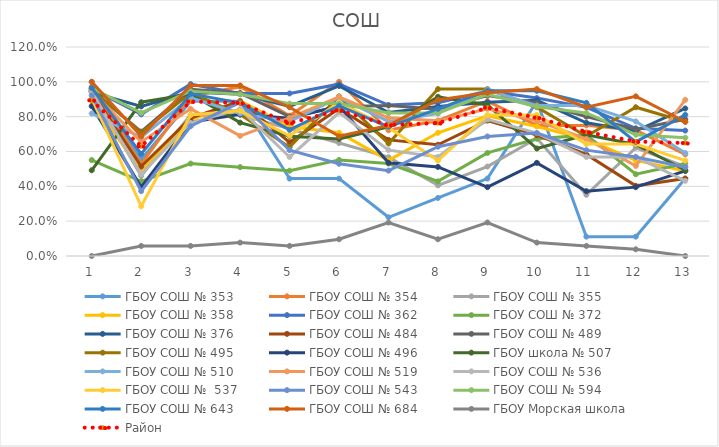
| Category | ГБОУ СОШ № 353 | ГБОУ СОШ № 354 | ГБОУ СОШ № 355 | ГБОУ СОШ № 358 | ГБОУ СОШ № 362 | ГБОУ СОШ № 372 | ГБОУ СОШ № 376 | ГБОУ СОШ № 484 | ГБОУ СОШ № 489 | ГБОУ СОШ № 495 | ГБОУ СОШ № 496 | ГБОУ школа № 507 | ГБОУ СОШ № 510 | ГБОУ СОШ № 519 | ГБОУ СОШ № 536 | ГБОУ СОШ №  537 | ГБОУ СОШ № 543 | ГБОУ СОШ № 594 | ГБОУ СОШ № 643 | ГБОУ СОШ № 684 | ГБОУ Морская школа | Район |
|---|---|---|---|---|---|---|---|---|---|---|---|---|---|---|---|---|---|---|---|---|---|---|
| 0 | 1 | 0.972 | 0.946 | 0.89 | 0.96 | 0.551 | 0.941 | 0.944 | 0.95 | 0.958 | 0.86 | 0.492 | 0.818 | 0.948 | 0.941 | 0.905 | 0.922 | 0.964 | 0.966 | 1 | 0 | 0.894 |
| 1 | 0.556 | 0.528 | 0.459 | 0.488 | 0.813 | 0.429 | 0.859 | 0.514 | 0.714 | 0.708 | 0.395 | 0.883 | 0.682 | 0.655 | 0.471 | 0.286 | 0.373 | 0.821 | 0.586 | 0.688 | 0.058 | 0.63 |
| 2 | 0.889 | 0.917 | 0.811 | 0.78 | 0.987 | 0.531 | 0.941 | 0.792 | 0.957 | 0.938 | 0.767 | 0.93 | 0.909 | 0.845 | 0.765 | 0.81 | 0.745 | 0.946 | 0.931 | 0.979 | 0.058 | 0.887 |
| 3 | 0.889 | 0.972 | 0.811 | 0.89 | 0.933 | 0.51 | 0.929 | 0.889 | 0.936 | 0.812 | 0.814 | 0.766 | 0.818 | 0.69 | 0.843 | 0.833 | 0.882 | 0.929 | 0.879 | 0.979 | 0.077 | 0.879 |
| 4 | 0.444 | 0.806 | 0.73 | 0.744 | 0.933 | 0.49 | 0.859 | 0.653 | 0.8 | 0.625 | 0.791 | 0.688 | 0.773 | 0.793 | 0.569 | 0.69 | 0.608 | 0.875 | 0.724 | 0.854 | 0.058 | 0.763 |
| 5 | 0.444 | 1 | 0.649 | 0.707 | 0.987 | 0.551 | 0.976 | 0.847 | 0.857 | 0.917 | 0.86 | 0.672 | 0.909 | 0.914 | 0.824 | 0.881 | 0.529 | 0.875 | 0.862 | 0.688 | 0.096 | 0.836 |
| 6 | 0.222 | 0.722 | 0.568 | 0.549 | 0.867 | 0.531 | 0.824 | 0.667 | 0.864 | 0.646 | 0.535 | 0.742 | 0.773 | 0.793 | 0.608 | 0.738 | 0.49 | 0.821 | 0.741 | 0.75 | 0.192 | 0.752 |
| 7 | 0.333 | 0.778 | 0.405 | 0.707 | 0.88 | 0.429 | 0.859 | 0.639 | 0.843 | 0.958 | 0.512 | 0.914 | 0.818 | 0.776 | 0.569 | 0.548 | 0.627 | 0.821 | 0.845 | 0.896 | 0.096 | 0.763 |
| 8 | 0.444 | 0.889 | 0.514 | 0.805 | 0.947 | 0.592 | 0.882 | 0.778 | 0.921 | 0.958 | 0.395 | 0.867 | 0.955 | 0.845 | 0.784 | 0.81 | 0.686 | 0.929 | 0.948 | 0.938 | 0.192 | 0.851 |
| 9 | 0.889 | 0.75 | 0.676 | 0.744 | 0.907 | 0.673 | 0.894 | 0.694 | 0.879 | 0.854 | 0.535 | 0.617 | 0.864 | 0.776 | 0.706 | 0.81 | 0.706 | 0.857 | 0.948 | 0.958 | 0.077 | 0.794 |
| 10 | 0.111 | 0.75 | 0.351 | 0.671 | 0.853 | 0.694 | 0.765 | 0.583 | 0.8 | 0.688 | 0.372 | 0.695 | 0.864 | 0.672 | 0.569 | 0.643 | 0.608 | 0.821 | 0.879 | 0.854 | 0.058 | 0.713 |
| 11 | 0.111 | 0.722 | 0.622 | 0.549 | 0.733 | 0.469 | 0.718 | 0.403 | 0.729 | 0.854 | 0.395 | 0.641 | 0.773 | 0.517 | 0.569 | 0.643 | 0.569 | 0.696 | 0.655 | 0.917 | 0.038 | 0.658 |
| 12 | 0.444 | 0.583 | 0.514 | 0.488 | 0.72 | 0.531 | 0.847 | 0.444 | 0.786 | 0.771 | 0.488 | 0.492 | 0.591 | 0.897 | 0.431 | 0.548 | 0.51 | 0.679 | 0.81 | 0.771 | 0 | 0.649 |